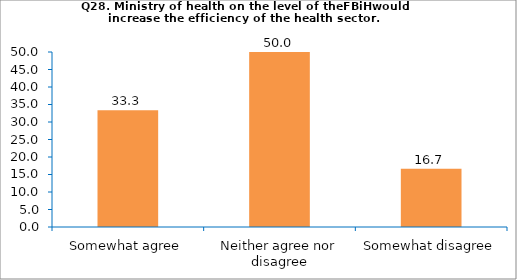
| Category | Series 0 |
|---|---|
| Somewhat agree | 33.333 |
| Neither agree nor disagree | 50 |
| Somewhat disagree | 16.667 |